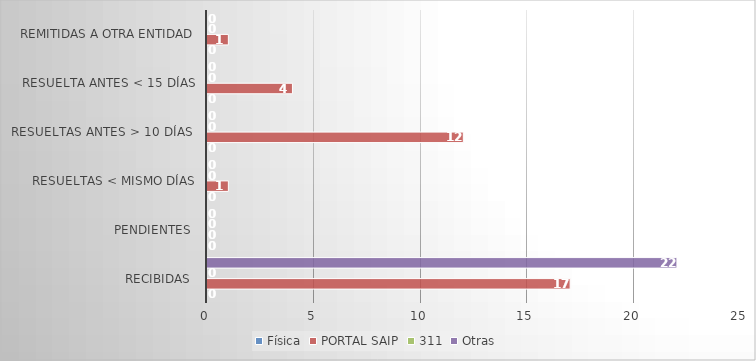
| Category | Física | PORTAL SAIP | 311 | Otras |
|---|---|---|---|---|
| Recibidas  | 0 | 17 | 0 | 22 |
| Pendientes  | 0 | 0 | 0 | 0 |
| Resueltas < mismo días | 0 | 1 | 0 | 0 |
| Resueltas antes > 10 días  | 0 | 12 | 0 | 0 |
| Resuelta antes < 15 días | 0 | 4 | 0 | 0 |
| Remitidas a otra entidad | 0 | 1 | 0 | 0 |